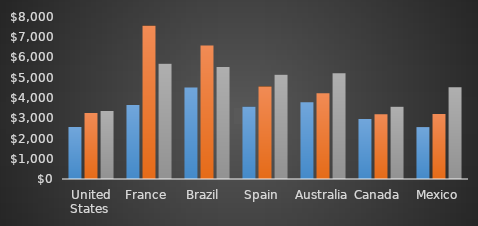
| Category | Product 1  | Product 2 | Product 3 |
|---|---|---|---|
| United States  | 2569 | 3256 | 3356 |
| France  | 3659 | 7569 | 5693 |
| Brazil  | 4523 | 6596 | 5532 |
| Spain  | 3568 | 4562 | 5142 |
| Australia  | 3789 | 4236 | 5224 |
| Canada  | 2963 | 3201 | 3562 |
| Mexico | 2563 | 3205 | 4526 |